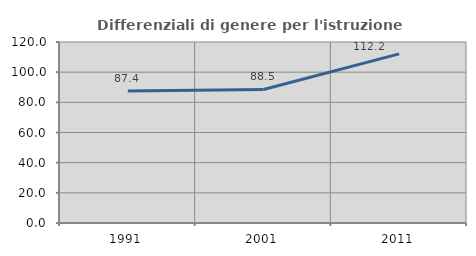
| Category | Differenziali di genere per l'istruzione superiore |
|---|---|
| 1991.0 | 87.438 |
| 2001.0 | 88.519 |
| 2011.0 | 112.157 |